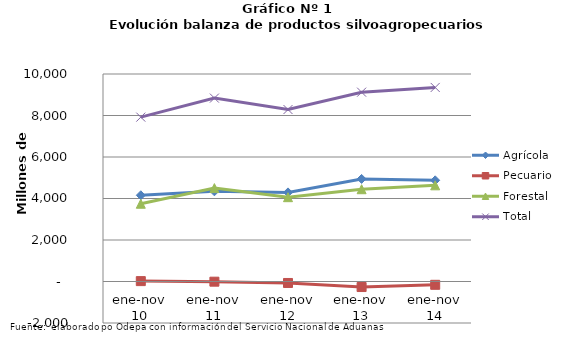
| Category | Agrícola | Pecuario | Forestal | Total |
|---|---|---|---|---|
| ene-nov 10 | 4155665 | 18820 | 3747081 | 7921566 |
| ene-nov 11 | 4344965 | -8440 | 4502058 | 8838583 |
| ene-nov 12 | 4294356 | -70872 | 4063414 | 8286898 |
| ene-nov 13 | 4944273 | -266813 | 4446954 | 9124414 |
| ene-nov 14 | 4876136 | -159515 | 4635205 | 9351826 |